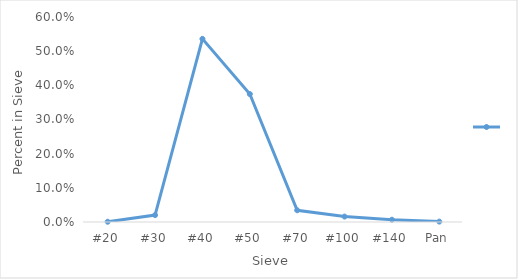
| Category | Series 0 |
|---|---|
| #20 | 0.001 |
| #30 | 0.02 |
| #40 | 0.536 |
| #50 | 0.374 |
| #70 | 0.034 |
| #100 | 0.016 |
| #140 | 0.007 |
| Pan | 0.001 |